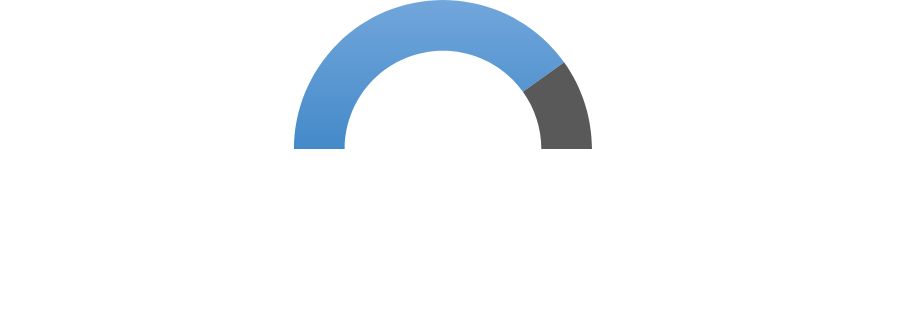
| Category | Series 0 |
|---|---|
| 0 | 802 |
| 1 | 198 |
| 2 | 1000 |